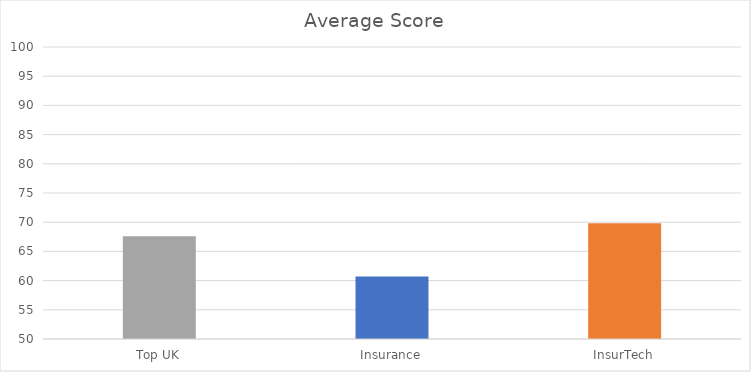
| Category | Score |
|---|---|
| Top UK | 67.6 |
| Insurance | 60.7 |
| InsurTech | 69.8 |